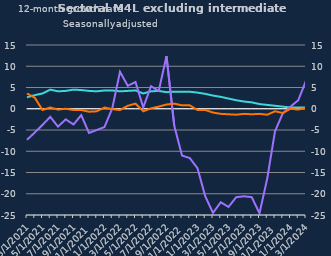
| Category | zero | Households | Non-intermediate OFCs |
|---|---|---|---|
| Mar-2021 | 0 | 2.7 | -7.3 |
| Apr-2021 | 0 | 3.2 | -5.6 |
| May-2021 | 0 | 3.6 | -3.8 |
| Jun-2021 | 0 | 4.5 | -1.9 |
| Jul-2021 | 0 | 4.1 | -4.2 |
| Aug-2021 | 0 | 4.2 | -2.5 |
| Sep-2021 | 0 | 4.5 | -3.7 |
| Oct-2021 | 0 | 4.4 | -1.5 |
| Nov-2021 | 0 | 4.2 | -5.7 |
| Dec-2021 | 0 | 4.1 | -5 |
| Jan-2022 | 0 | 4.3 | -4.3 |
| Feb-2022 | 0 | 4.3 | 0.1 |
| Mar-2022 | 0 | 4.1 | 8.7 |
| Apr-2022 | 0 | 4.2 | 5.4 |
| May-2022 | 0 | 4.3 | 6.3 |
| Jun-2022 | 0 | 3.6 | 0.3 |
| Jul-2022 | 0 | 4.1 | 5.3 |
| Aug-2022 | 0 | 4.2 | 4.2 |
| Sep-2022 | 0 | 3.9 | 12.4 |
| Oct-2022 | 0 | 4 | -4 |
| Nov-2022 | 0 | 4 | -11 |
| Dec-2022 | 0 | 4 | -11.6 |
| Jan-2023 | 0 | 3.8 | -14 |
| Feb-2023 | 0 | 3.5 | -20.6 |
| Mar-2023 | 0 | 3.1 | -24.5 |
| Apr-2023 | 0 | 2.8 | -22 |
| May-2023 | 0 | 2.4 | -23.1 |
| Jun-2023 | 0 | 2 | -20.8 |
| Jul-2023 | 0 | 1.7 | -20.6 |
| Aug-2023 | 0 | 1.5 | -20.8 |
| Sep-2023 | 0 | 1.1 | -24.6 |
| Oct-2023 | 0 | 0.9 | -16.4 |
| Nov-2023 | 0 | 0.7 | -5.3 |
| Dec-2023 | 0 | 0.5 | -1.1 |
| Jan-2024 | 0 | 0.3 | 0.5 |
| Feb-2024 | 0 | 0.3 | 2 |
| Mar-2024 | 0 | 0.3 | 6.6 |